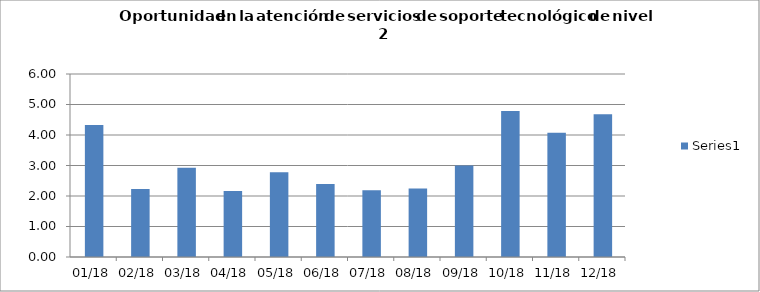
| Category | Series 0 |
|---|---|
| 2018-01-01 | 4.33 |
| 2018-02-01 | 2.23 |
| 2018-03-01 | 2.93 |
| 2018-04-01 | 2.16 |
| 2018-05-01 | 2.78 |
| 2018-06-01 | 2.39 |
| 2018-07-01 | 2.19 |
| 2018-08-01 | 2.25 |
| 2018-09-01 | 3 |
| 2018-10-01 | 4.79 |
| 2018-11-01 | 4.07 |
| 2018-12-01 | 4.68 |